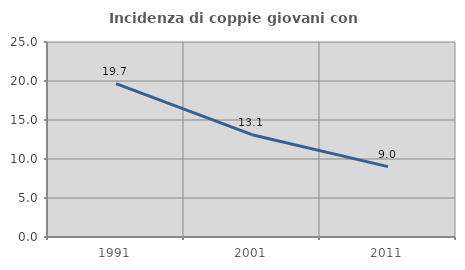
| Category | Incidenza di coppie giovani con figli |
|---|---|
| 1991.0 | 19.651 |
| 2001.0 | 13.117 |
| 2011.0 | 9.023 |